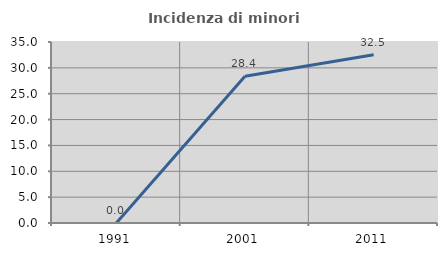
| Category | Incidenza di minori stranieri |
|---|---|
| 1991.0 | 0 |
| 2001.0 | 28.378 |
| 2011.0 | 32.54 |